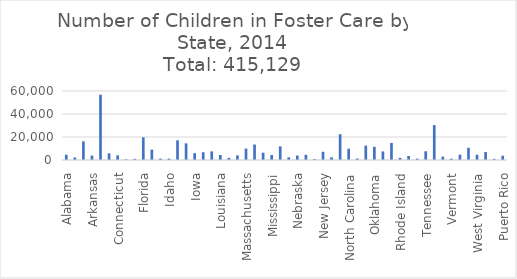
| Category | FY 2014 |
|---|---|
| Alabama | 4556 |
| Alaska | 2190 |
| Arizona | 16246 |
| Arkansas | 3806 |
| California | 56771 |
| Colorado | 5787 |
| Connecticut | 4069 |
| Delaware | 635 |
| District of Columbia | 981 |
| Florida | 19712 |
| Georgia | 9005 |
| Hawaii | 1221 |
| Idaho | 1208 |
| Illinois | 17140 |
| Indiana | 14452 |
| Iowa | 5978 |
| Kansas | 6762 |
| Kentucky | 7506 |
| Louisiana | 4329 |
| Maine | 1864 |
| Maryland | 4032 |
| Massachusetts | 9940 |
| Michigan | 13452 |
| Minnesota | 6324 |
| Mississippi | 4380 |
| Missouri | 11834 |
| Montana | 2345 |
| Nebraska | 3863 |
| Nevada | 4543 |
| New Hampshire | 885 |
| New Jersey | 7138 |
| New Mexico | 2366 |
| New York | 22422 |
| North Carolina | 9859 |
| North Dakota | 1365 |
| Ohio | 12519 |
| Oklahoma | 11463 |
| Oregon | 7444 |
| Pennsylvania | 14840 |
| Rhode Island | 1832 |
| South Carolina | 3461 |
| South Dakota | 1174 |
| Tennessee | 7607 |
| Texas | 30358 |
| Utah | 2960 |
| Vermont | 1123 |
| Virginia | 4597 |
| Washington | 10630 |
| West Virginia | 4556 |
| Wisconsin | 6918 |
| Wyoming | 985 |
| Puerto Rico | 3696 |